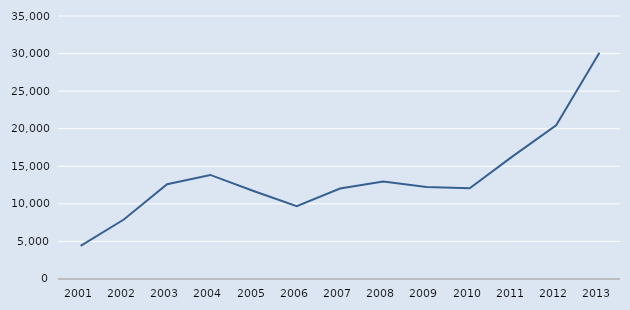
| Category | Series 0 |
|---|---|
| 2001.0 | 4396 |
| 2002.0 | 7915 |
| 2003.0 | 12603 |
| 2004.0 | 13850 |
| 2005.0 | 11710 |
| 2006.0 | 9700 |
| 2007.0 | 12040 |
| 2008.0 | 12980 |
| 2009.0 | 12230 |
| 2010.0 | 12080 |
| 2011.0 | 16350 |
| 2012.0 | 20443 |
| 2013.0 | 30121 |